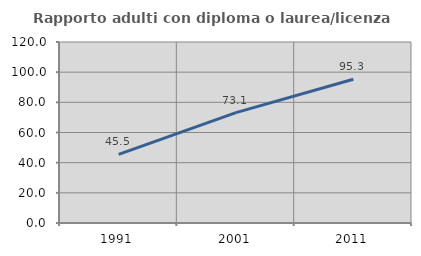
| Category | Rapporto adulti con diploma o laurea/licenza media  |
|---|---|
| 1991.0 | 45.48 |
| 2001.0 | 73.149 |
| 2011.0 | 95.337 |